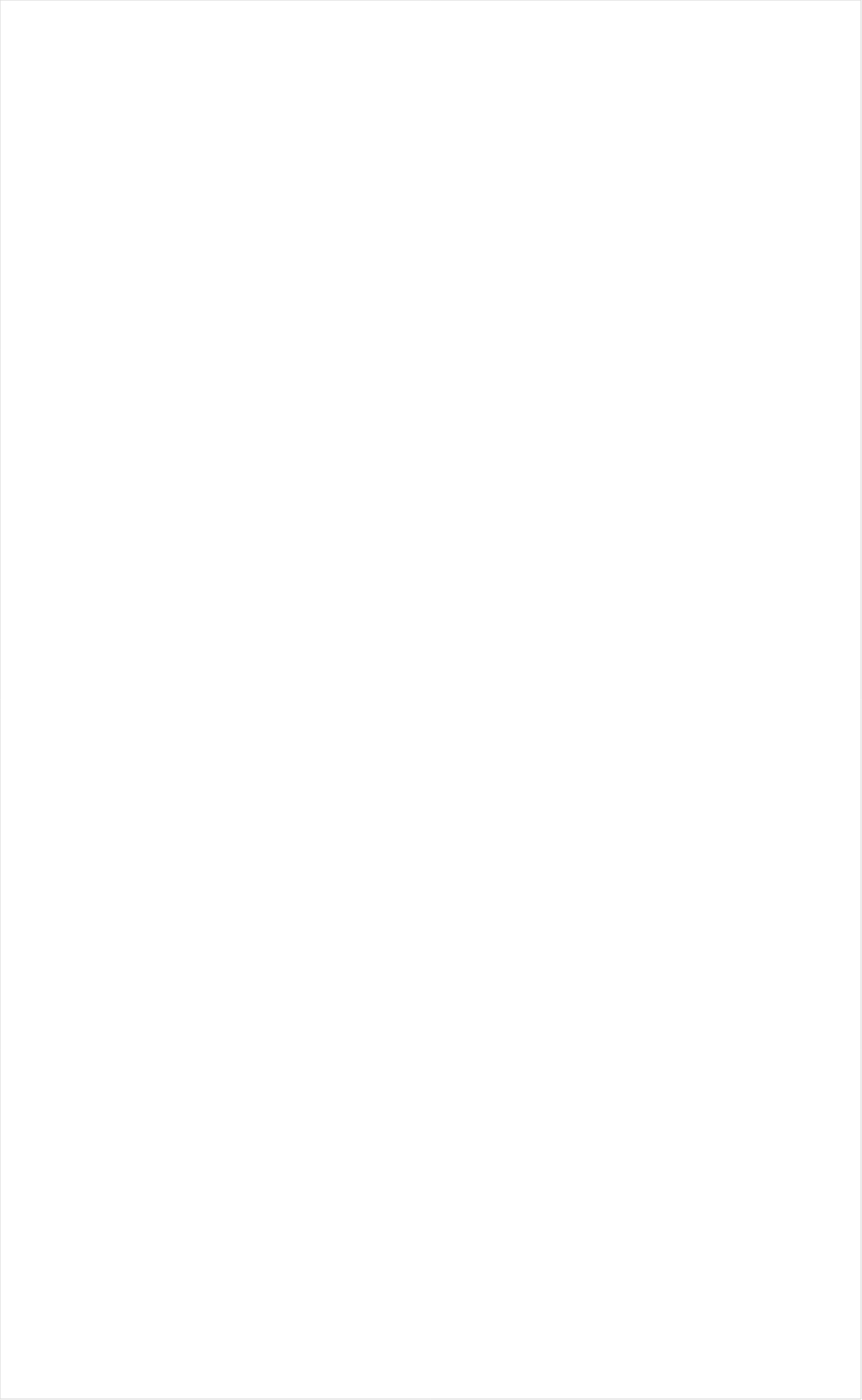
| Category | Total |
|---|---|
| RFD TV | -0.308 |
| PAC-12 Network | -0.266 |
| Tennis Channel | -0.196 |
| Fox Business | -0.196 |
| Hallmark Movies & Mysteries | -0.19 |
| PBS | -0.188 |
| MSNBC | -0.185 |
| INSP | -0.164 |
| Smithsonian | -0.156 |
| American Heroes Channel | -0.153 |
| Fox News | -0.142 |
| Hallmark | -0.141 |
| Science Channel | -0.127 |
| CBS | -0.123 |
| MLB Network | -0.119 |
| National Geographic Wild | -0.118 |
| Big Ten Network | -0.113 |
| Destination America | -0.108 |
| DIY | -0.106 |
| Olympic Channel | -0.102 |
| Reelz Channel | -0.102 |
| POP | -0.101 |
| SundanceTV | -0.1 |
| CNN | -0.095 |
| History Channel | -0.095 |
| Weather Channel | -0.089 |
| FYI | -0.082 |
| The Sportsman Channel | -0.082 |
| WGN America | -0.078 |
| Bloomberg HD | -0.078 |
| Cooking Channel | -0.075 |
| HGTV | -0.073 |
| Outdoor Channel | -0.073 |
| National Geographic | -0.072 |
| NBC | -0.072 |
| CW | -0.066 |
| BBC America | -0.064 |
| ABC | -0.063 |
| Golf | -0.062 |
| TV LAND | -0.061 |
| ESPNU | -0.058 |
| MyNetworkTV | -0.058 |
| Investigation Discovery | -0.056 |
| Logo | -0.056 |
| Animal Planet | -0.056 |
| ION | -0.055 |
| Motor Trend Network | -0.053 |
| Headline News | -0.052 |
| Game Show | -0.051 |
| Discovery Channel | -0.049 |
| Fox Sports 1 | -0.048 |
| OXYGEN | -0.047 |
| Oprah Winfrey Network | -0.043 |
| NHL | -0.039 |
| UP TV | -0.038 |
| Travel | -0.038 |
| Great American Country | -0.036 |
| Ovation | -0.036 |
| NBC Sports | -0.034 |
| AMC | -0.032 |
| FOX | -0.03 |
| CBS Sports | -0.029 |
| CMTV | -0.02 |
| A&E | -0.016 |
| BET Her | -0.013 |
| WE TV | -0.009 |
| ESPNEWS | -0.008 |
| FX Movie Channel | -0.002 |
| Food Network | 0 |
| Independent Film (IFC) | 0.001 |
| Discovery Family Channel | 0.002 |
| TLC | 0.009 |
| SYFY | 0.016 |
| Lifetime | 0.017 |
| USA Network | 0.018 |
| TBS | 0.02 |
| CNBC | 0.021 |
| TNT | 0.021 |
| TV ONE | 0.026 |
| Paramount Network | 0.028 |
| Viceland | 0.031 |
| BRAVO | 0.037 |
| Disney XD | 0.04 |
| FX | 0.043 |
| NFL Network | 0.051 |
| Lifetime Movies | 0.055 |
| Discovery Life Channel | 0.059 |
| ESPN | 0.063 |
| FXDEP | 0.064 |
| ESPN Deportes | 0.067 |
| ESPN2 | 0.07 |
| truTV | 0.092 |
| E! | 0.093 |
| Comedy Central | 0.098 |
| NBA TV | 0.11 |
| MTV2 | 0.12 |
| FXX | 0.125 |
| BET | 0.126 |
| Disney Channel | 0.128 |
| Teen Nick | 0.138 |
| Freeform | 0.138 |
| Nick@Nite | 0.143 |
| Universal Kids | 0.148 |
| Nick | 0.167 |
| VH1 | 0.185 |
| MTV | 0.191 |
| Adult Swim | 0.193 |
| Nick Toons | 0.193 |
| Univision | 0.215 |
| Cartoon Network | 0.22 |
| Telemundo | 0.22 |
| UniMas | 0.226 |
| Galavision | 0.227 |
| NBC Universo | 0.227 |
| Nick Jr. | 0.312 |
| TUDN | 0.315 |
| Disney Junior US | 0.342 |